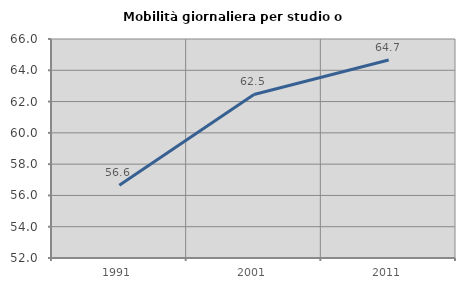
| Category | Mobilità giornaliera per studio o lavoro |
|---|---|
| 1991.0 | 56.646 |
| 2001.0 | 62.455 |
| 2011.0 | 64.661 |